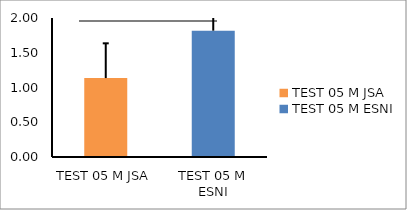
| Category | Series 0 |
|---|---|
| TEST 05 M JSA | 1.136 |
| TEST 05 M ESNI | 1.818 |